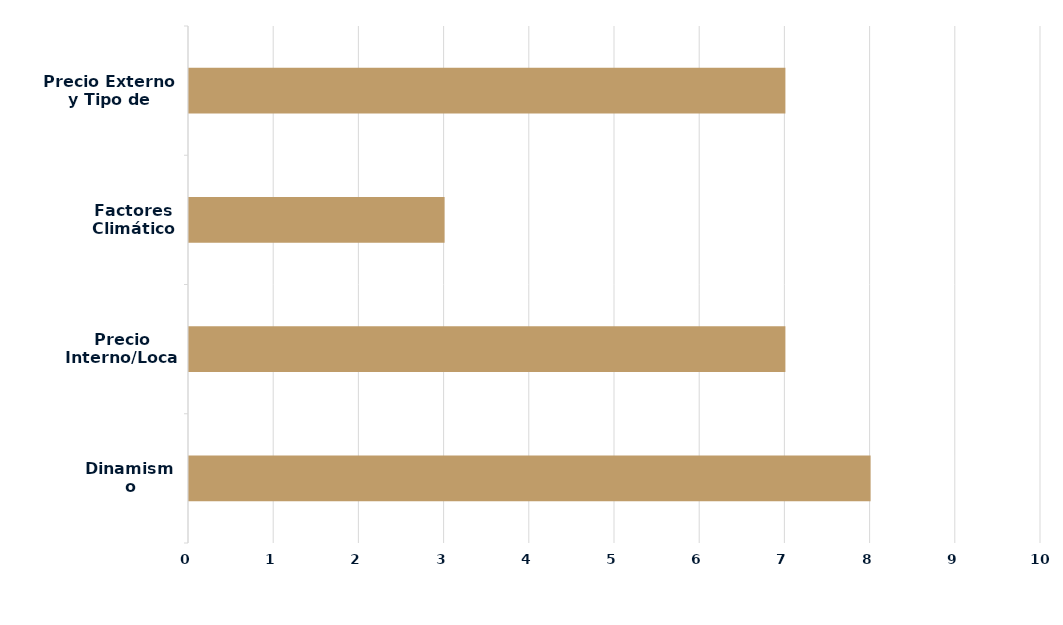
| Category | Series 0 |
|---|---|
| Dinamismo Demanda | 8 |
| Precio Interno/Local | 7 |
| Factores Climáticos | 3 |
| Precio Externo y Tipo de Cambio | 7 |